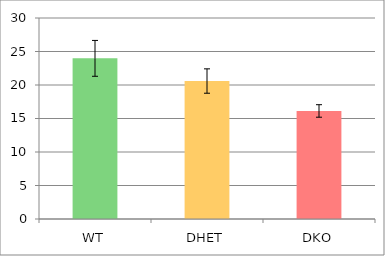
| Category | Series 0 |
|---|---|
| WT | 23.976 |
| DHET | 20.59 |
| DKO | 16.126 |